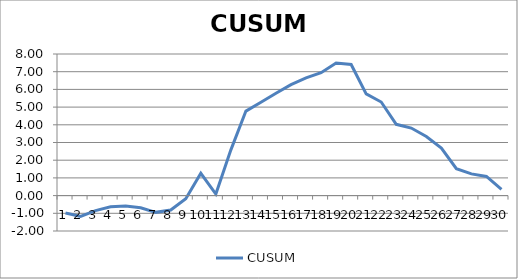
| Category | CUSUM |
|---|---|
| 0 | -0.983 |
| 1 | -1.179 |
| 2 | -0.845 |
| 3 | -0.63 |
| 4 | -0.593 |
| 5 | -0.69 |
| 6 | -0.946 |
| 7 | -0.811 |
| 8 | -0.177 |
| 9 | 1.259 |
| 10 | 0.087 |
| 11 | 2.584 |
| 12 | 4.775 |
| 13 | 5.27 |
| 14 | 5.785 |
| 15 | 6.265 |
| 16 | 6.647 |
| 17 | 6.946 |
| 18 | 7.495 |
| 19 | 7.407 |
| 20 | 5.744 |
| 21 | 5.287 |
| 22 | 4.027 |
| 23 | 3.817 |
| 24 | 3.339 |
| 25 | 2.686 |
| 26 | 1.524 |
| 27 | 1.227 |
| 28 | 1.082 |
| 29 | 0.348 |